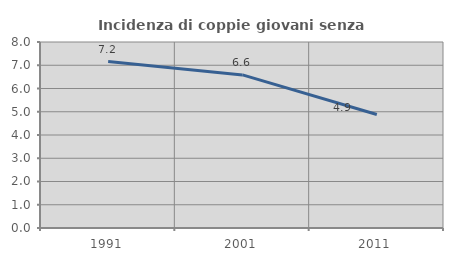
| Category | Incidenza di coppie giovani senza figli |
|---|---|
| 1991.0 | 7.159 |
| 2001.0 | 6.584 |
| 2011.0 | 4.882 |